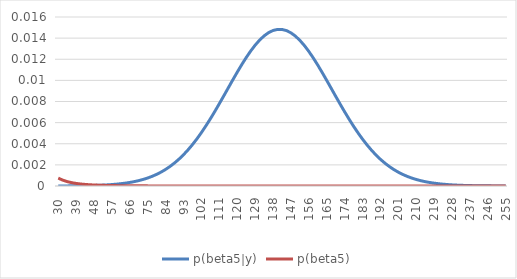
| Category | p(beta5|y) | p(beta5) |
|---|---|---|
| 30.0 | 0 | 0.001 |
| 32.25 | 0 | 0.001 |
| 34.5 | 0 | 0 |
| 36.75 | 0 | 0 |
| 39.0 | 0 | 0 |
| 41.25 | 0 | 0 |
| 43.5 | 0 | 0 |
| 45.75 | 0 | 0 |
| 48.0 | 0 | 0 |
| 50.25 | 0 | 0 |
| 52.5 | 0 | 0 |
| 54.75 | 0 | 0 |
| 57.0 | 0 | 0 |
| 59.25 | 0 | 0 |
| 61.5 | 0 | 0 |
| 63.75 | 0 | 0 |
| 66.0 | 0 | 0 |
| 68.25 | 0 | 0 |
| 70.5 | 0.001 | 0 |
| 72.75 | 0.001 | 0 |
| 75.0 | 0.001 | 0 |
| 77.25 | 0.001 | 0 |
| 79.5 | 0.001 | 0 |
| 81.75 | 0.001 | 0 |
| 84.0 | 0.002 | 0 |
| 86.25 | 0.002 | 0 |
| 88.5 | 0.002 | 0 |
| 90.75 | 0.003 | 0 |
| 93.0 | 0.003 | 0 |
| 95.25 | 0.003 | 0 |
| 97.5 | 0.004 | 0 |
| 99.75 | 0.004 | 0 |
| 102.0 | 0.005 | 0 |
| 104.25 | 0.006 | 0 |
| 106.5 | 0.006 | 0 |
| 108.75 | 0.007 | 0 |
| 111.0 | 0.008 | 0 |
| 113.25 | 0.009 | 0 |
| 115.5 | 0.009 | 0 |
| 117.75 | 0.01 | 0 |
| 120.0 | 0.011 | 0 |
| 122.25 | 0.011 | 0 |
| 124.5 | 0.012 | 0 |
| 126.75 | 0.013 | 0 |
| 129.0 | 0.013 | 0 |
| 131.25 | 0.014 | 0 |
| 133.5 | 0.014 | 0 |
| 135.75 | 0.015 | 0 |
| 138.0 | 0.015 | 0 |
| 140.25 | 0.015 | 0 |
| 142.5 | 0.015 | 0 |
| 144.75 | 0.015 | 0 |
| 147.0 | 0.014 | 0 |
| 149.25 | 0.014 | 0 |
| 151.5 | 0.014 | 0 |
| 153.75 | 0.013 | 0 |
| 156.0 | 0.013 | 0 |
| 158.25 | 0.012 | 0 |
| 160.5 | 0.011 | 0 |
| 162.75 | 0.011 | 0 |
| 165.0 | 0.01 | 0 |
| 167.25 | 0.009 | 0 |
| 169.5 | 0.008 | 0 |
| 171.75 | 0.008 | 0 |
| 174.0 | 0.007 | 0 |
| 176.25 | 0.006 | 0 |
| 178.5 | 0.006 | 0 |
| 180.75 | 0.005 | 0 |
| 183.0 | 0.004 | 0 |
| 185.25 | 0.004 | 0 |
| 187.5 | 0.003 | 0 |
| 189.75 | 0.003 | 0 |
| 192.0 | 0.003 | 0 |
| 194.25 | 0.002 | 0 |
| 196.5 | 0.002 | 0 |
| 198.75 | 0.002 | 0 |
| 201.0 | 0.001 | 0 |
| 203.25 | 0.001 | 0 |
| 205.5 | 0.001 | 0 |
| 207.75 | 0.001 | 0 |
| 210.0 | 0.001 | 0 |
| 212.25 | 0.001 | 0 |
| 214.5 | 0 | 0 |
| 216.75 | 0 | 0 |
| 219.0 | 0 | 0 |
| 221.25 | 0 | 0 |
| 223.5 | 0 | 0 |
| 225.75 | 0 | 0 |
| 228.0 | 0 | 0 |
| 230.25 | 0 | 0 |
| 232.5 | 0 | 0 |
| 234.75 | 0 | 0 |
| 237.0 | 0 | 0 |
| 239.25 | 0 | 0 |
| 241.5 | 0 | 0 |
| 243.75 | 0 | 0 |
| 246.0 | 0 | 0 |
| 248.25 | 0 | 0 |
| 250.5 | 0 | 0 |
| 252.75 | 0 | 0 |
| 255.0 | 0 | 0 |